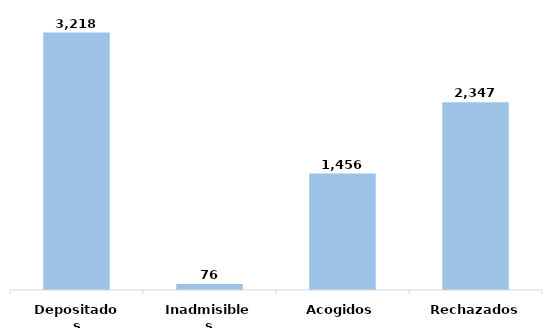
| Category | Series 0 |
|---|---|
| Depositados | 3218 |
| Inadmisibles | 76 |
| Acogidos | 1456 |
| Rechazados | 2347 |